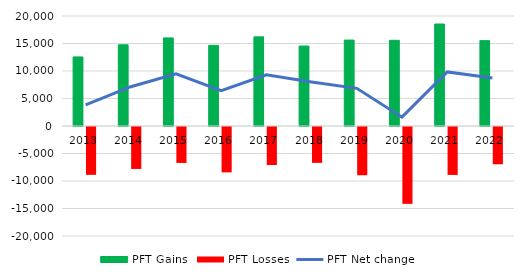
| Category | PFT Gains  | PFT Losses |
|---|---|---|
| 2013 | 12556 | -8699 |
| 2014 | 14767 | -7626 |
| 2015 | 16022 | -6536 |
| 2016 | 14665 | -8248 |
| 2017 | 16205 | -6906 |
| 2018 | 14539 | -6523 |
| 2019 | 15621 | -8771 |
| 2020 | 15580 | -13970 |
| 2021 | 18544 | -8717 |
| 2022 | 15520 | -6775 |